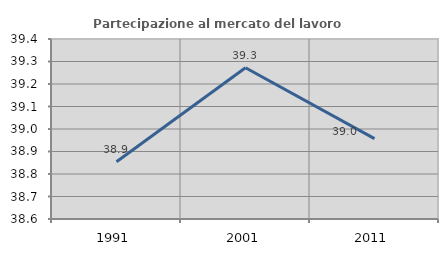
| Category | Partecipazione al mercato del lavoro  femminile |
|---|---|
| 1991.0 | 38.854 |
| 2001.0 | 39.272 |
| 2011.0 | 38.957 |